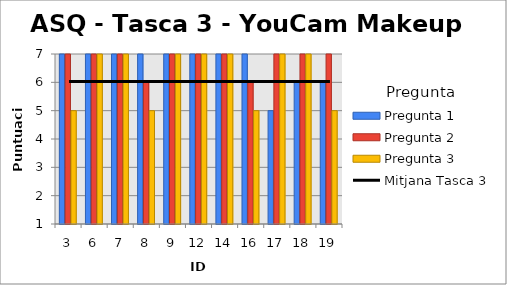
| Category | Pregunta 1 | Pregunta 2 | Pregunta 3 |
|---|---|---|---|
| 3.0 | 7 | 7 | 5 |
| 6.0 | 7 | 7 | 7 |
| 7.0 | 7 | 7 | 7 |
| 8.0 | 7 | 6 | 5 |
| 9.0 | 7 | 7 | 7 |
| 12.0 | 7 | 7 | 7 |
| 14.0 | 7 | 7 | 7 |
| 16.0 | 7 | 6 | 5 |
| 17.0 | 5 | 7 | 7 |
| 18.0 | 6 | 7 | 7 |
| 19.0 | 6 | 7 | 5 |